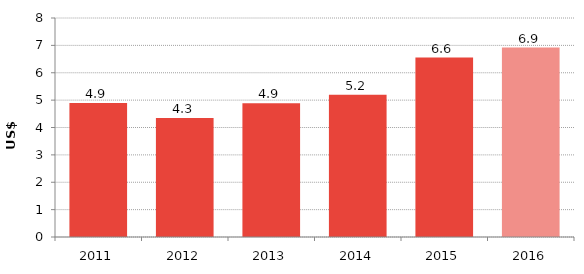
| Category | US$ billions |
|---|---|
| 2011.0 | 4.891 |
| 2012.0 | 4.35 |
| 2013.0 | 4.886 |
| 2014.0 | 5.2 |
| 2015.0 | 6.556 |
| 2016.0 | 6.921 |